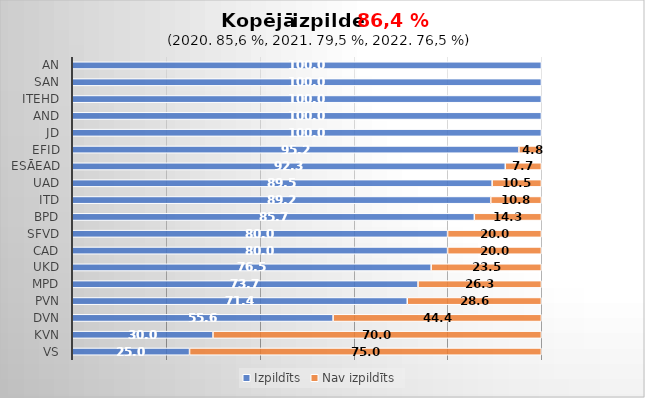
| Category | Izpildīts | Nav izpildīts |
|---|---|---|
| VS | 25 | 75 |
| KVN | 30 | 70 |
| DVN | 55.6 | 44.4 |
| PVN | 71.4 | 28.6 |
| MPD | 73.7 | 26.3 |
| UKD | 76.5 | 23.5 |
| CAD | 80 | 20 |
| SFVD | 80 | 20 |
| BPD | 85.7 | 14.3 |
| ITD | 89.2 | 10.8 |
| UAD | 89.5 | 10.5 |
| ESĀEAD | 92.3 | 7.7 |
| EFID | 95.2 | 4.8 |
| JD | 100 | 0 |
| AND | 100 | 0 |
| ITEHD | 100 | 0 |
| SAN | 100 | 0 |
| AN | 100 | 0 |